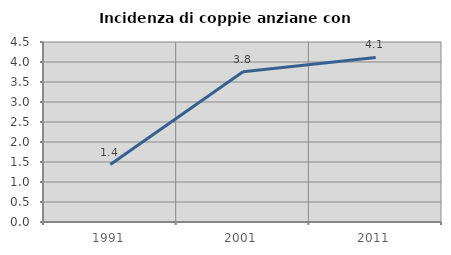
| Category | Incidenza di coppie anziane con figli |
|---|---|
| 1991.0 | 1.436 |
| 2001.0 | 3.754 |
| 2011.0 | 4.114 |